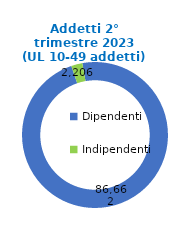
| Category | Series 0 |
|---|---|
| Dipendenti | 86662 |
| Indipendenti | 2206 |